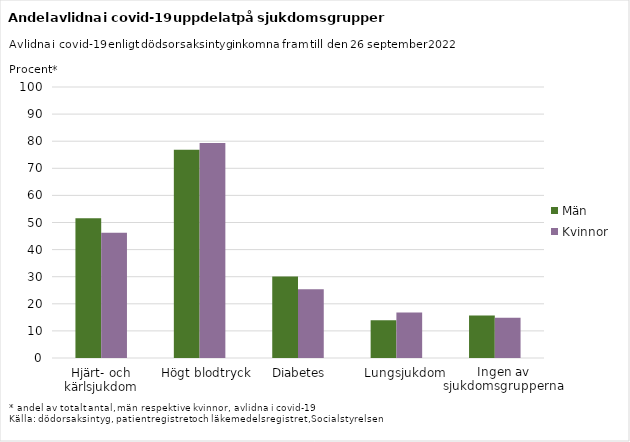
| Category | Män | Kvinnor |
|---|---|---|
| Hjärt- och kärlsjukdom | 51.61 | 46.23 |
| Högt blodtryck | 76.86 | 79.3 |
| Diabetes | 30.04 | 25.33 |
| Lungsjukdom | 13.92 | 16.8 |
| Ingen av sjukdomsgrupperna | 15.67 | 14.88 |